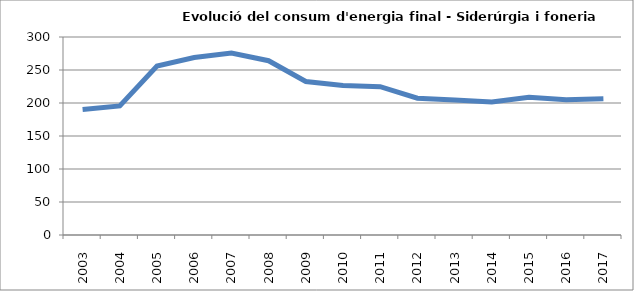
| Category | 190,3 195,5 255,9 269,0 275,8 264,1 232,6 226,6 224,8 207,2 204,5 201,6 208,8 205,0 206,6 |
|---|---|
| 2003.0 | 190.3 |
| 2004.0 | 195.5 |
| 2005.0 | 255.9 |
| 2006.0 | 269 |
| 2007.0 | 275.8 |
| 2008.0 | 264.1 |
| 2009.0 | 232.6 |
| 2010.0 | 226.6 |
| 2011.0 | 224.8 |
| 2012.0 | 207.2 |
| 2013.0 | 204.5 |
| 2014.0 | 201.6 |
| 2015.0 | 208.8 |
| 2016.0 | 205 |
| 2017.0 | 206.6 |